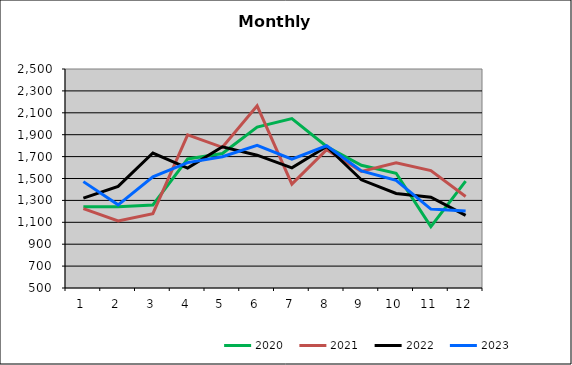
| Category | 2020 | 2021 | 2022 | 2023 |
|---|---|---|---|---|
| 0 | 1241.004 | 1224.945 | 1320.378 | 1471.48 |
| 1 | 1241.851 | 1112.955 | 1427.347 | 1259.701 |
| 2 | 1257.948 | 1179.01 | 1732.641 | 1515.608 |
| 3 | 1678.799 | 1897.827 | 1594.906 | 1645.05 |
| 4 | 1728.302 | 1784.624 | 1789.593 | 1699.325 |
| 5 | 1969.438 | 2163.63 | 1712.772 | 1802.435 |
| 6 | 2046.582 | 1448.352 | 1597.715 | 1677.666 |
| 7 | 1792.692 | 1763.243 | 1792.018 | 1798.772 |
| 8 | 1620.398 | 1564.861 | 1487.937 | 1568.78 |
| 9 | 1547.501 | 1643.384 | 1362.939 | 1483.215 |
| 10 | 1060.179 | 1572.259 | 1328.637 | 1220.43 |
| 11 | 1476.203 | 1336.135 | 1163.728 | 1203.753 |